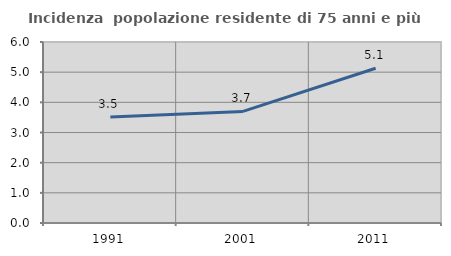
| Category | Incidenza  popolazione residente di 75 anni e più |
|---|---|
| 1991.0 | 3.518 |
| 2001.0 | 3.699 |
| 2011.0 | 5.131 |